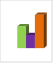
| Category | област Благоевград |
|---|---|
| летен сезон 2019  | 397364 |
| летен сезон 2021  | 374629 |
| летен сезон 2022 г.  | 427264 |